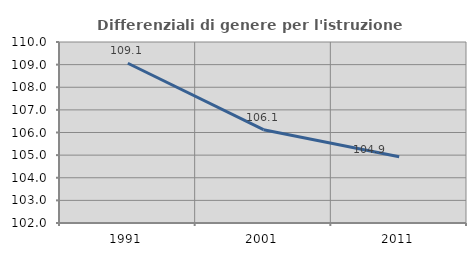
| Category | Differenziali di genere per l'istruzione superiore |
|---|---|
| 1991.0 | 109.06 |
| 2001.0 | 106.123 |
| 2011.0 | 104.925 |